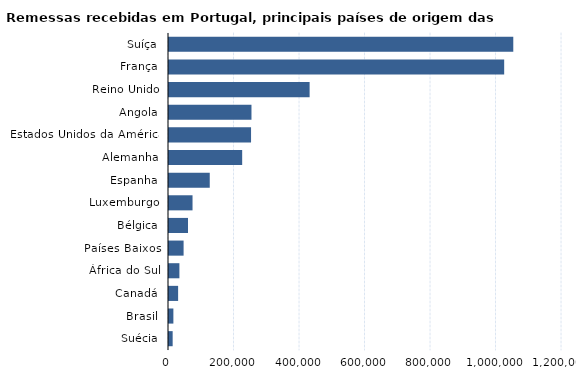
| Category | Series 2 |
|---|---|
| Suíça | 1051260 |
| França | 1023450 |
| Reino Unido | 429380 |
| Angola | 251820 |
| Estados Unidos da América | 250540 |
| Alemanha | 223440 |
| Espanha | 124440 |
| Luxemburgo | 71850 |
| Bélgica | 58050 |
| Países Baixos | 44560 |
| África do Sul | 31770 |
| Canadá | 27850 |
| Brasil | 13370 |
| Suécia | 11170 |